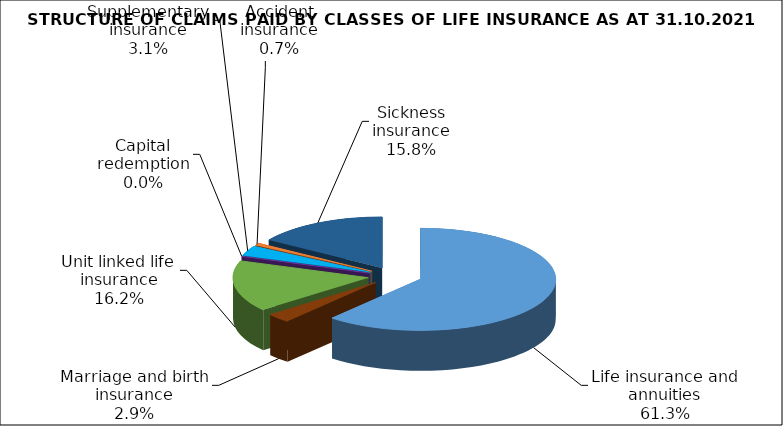
| Category | Series 0 |
|---|---|
| Life insurance and annuities | 111193075.396 |
| Marriage and birth insurance | 5246489.511 |
| Unit linked life insurance | 29388261.822 |
| Capital redemption | 0 |
| Supplementary insurance | 5674048.244 |
| Accident insurance | 1349843.11 |
| Sickness insurance | 28634324.298 |